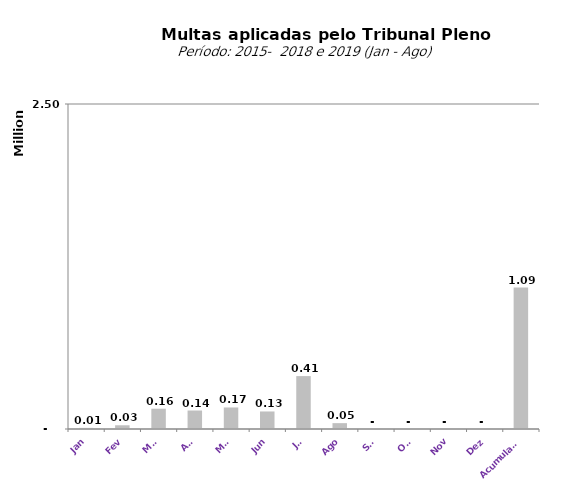
| Category |  1.528.442,62   1.020.189,59   955.160,44   1.276.425,53   2.644.178,81   1.648.289,39   21.112.065,42   6.109.976,68   8.587,38   28.774,76   156.096,39   142.268,21   165.562,13   134.846,46   406.938,07   45.095,60   -     -     -     -    |
|---|---|
| Jan | 8587.38 |
| Fev | 28774.76 |
| Mar | 156096.39 |
| Abr | 142268.21 |
| Mai | 165562.13 |
| Jun | 134846.46 |
| Jul | 406938.07 |
| Ago | 45095.6 |
| Set | 0 |
| Out | 0 |
| Nov | 0 |
| Dez | 0 |
| Acumulado | 1088169 |